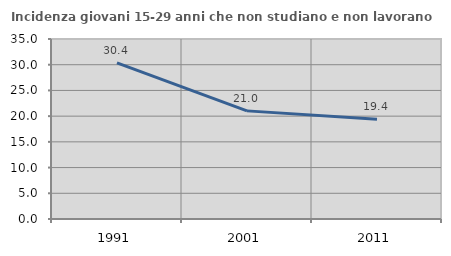
| Category | Incidenza giovani 15-29 anni che non studiano e non lavorano  |
|---|---|
| 1991.0 | 30.364 |
| 2001.0 | 21.024 |
| 2011.0 | 19.394 |